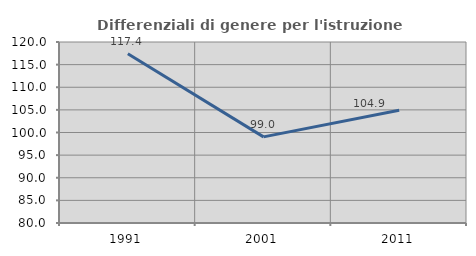
| Category | Differenziali di genere per l'istruzione superiore |
|---|---|
| 1991.0 | 117.394 |
| 2001.0 | 99.039 |
| 2011.0 | 104.92 |